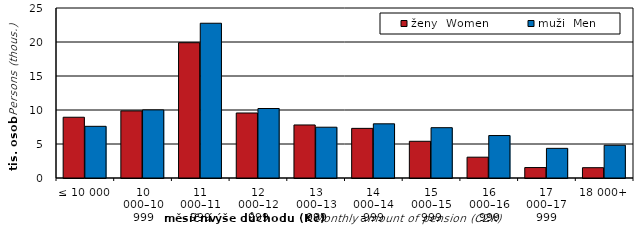
| Category | ženy  Women | muži  Men |
|---|---|---|
| ≤ 10 000 | 8935 | 7601 |
| 10 000–10 999 | 9867 | 10017 |
| 11 000–11 999 | 19897 | 22758 |
| 12 000–12 999 | 9560 | 10219 |
| 13 000–13 999 | 7799 | 7468 |
| 14 000–14 999 | 7299 | 7967 |
| 15 000–15 999 | 5398 | 7399 |
| 16 000–16 999 | 3062 | 6244 |
| 17 000–17 999 | 1535 | 4360 |
| 18 000+ | 1515 | 4815 |